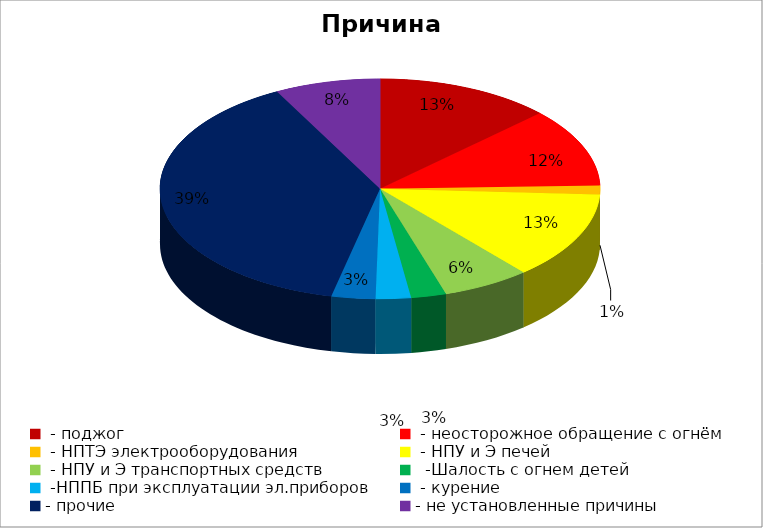
| Category | Причина пожара |
|---|---|
|  - поджог | 20 |
|  - неосторожное обращение с огнём | 18 |
|  - НПТЭ электрооборудования | 2 |
|  - НПУ и Э печей | 20 |
|  - НПУ и Э транспортных средств | 10 |
|   -Шалость с огнем детей | 4 |
|  -НППБ при эксплуатации эл.приборов | 4 |
|  - курение | 5 |
| - прочие | 60 |
| - не установленные причины | 12 |